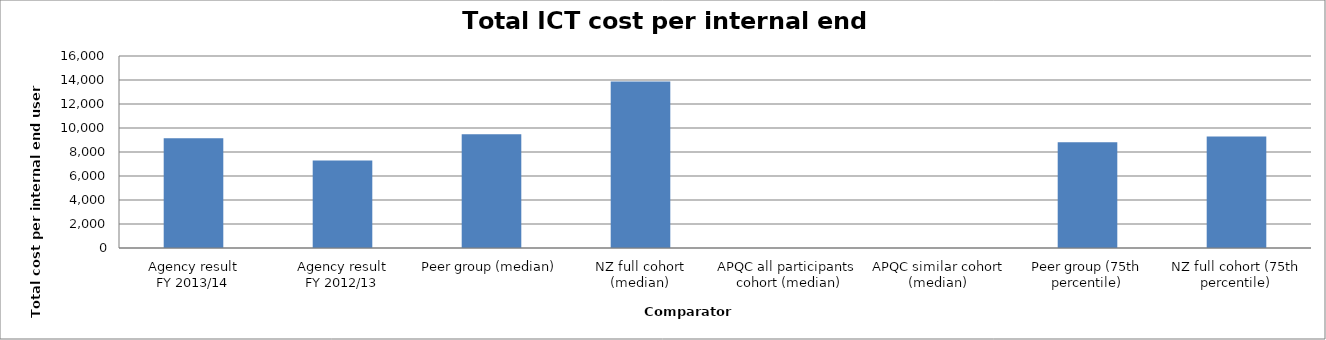
| Category | Result |
|---|---|
| Agency result
FY 2013/14 | 9142 |
| Agency result
FY 2012/13 | 7282.328 |
| Peer group (median) | 9488.235 |
| NZ full cohort (median) | 13866.17 |
| APQC all participants 
cohort (median) | 0 |
| APQC similar cohort (median) | 0 |
| Peer group (75th percentile) | 8803.899 |
| NZ full cohort (75th percentile) | 9283.447 |